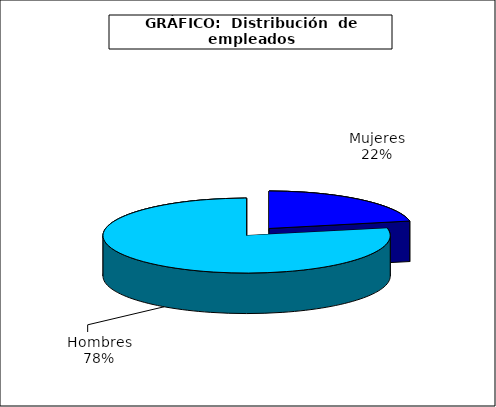
| Category | persona |
|---|---|
| 0 | 4054.876 |
| 1 | 14532.035 |